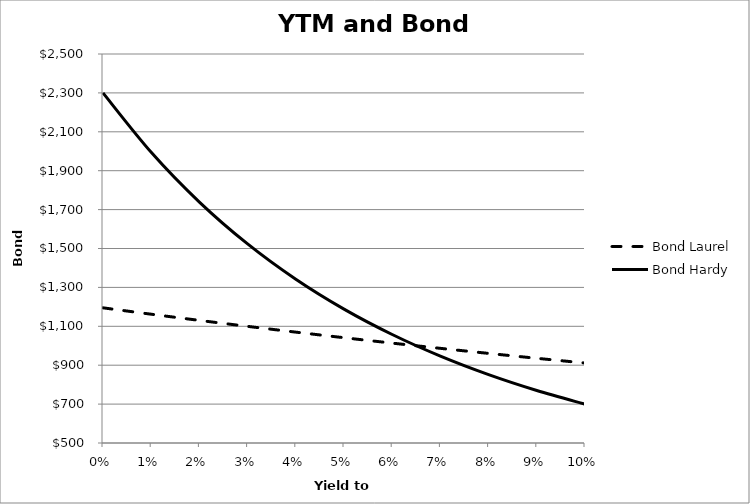
| Category | Bond Laurel | Bond Hardy |
|---|---|---|
| 0.0 | 1195 | 2300 |
| 0.01 | 1162.151 | 1994.736 |
| 0.02 | 1130.398 | 1738.78 |
| 0.03 | 1099.701 | 1523.527 |
| 0.04 | 1070.018 | 1341.943 |
| 0.05 | 1041.311 | 1188.271 |
| 0.06 | 1013.543 | 1057.787 |
| 0.07 | 986.679 | 946.612 |
| 0.08 | 960.684 | 851.554 |
| 0.09 | 935.527 | 769.98 |
| 0.1 | 911.175 | 699.716 |